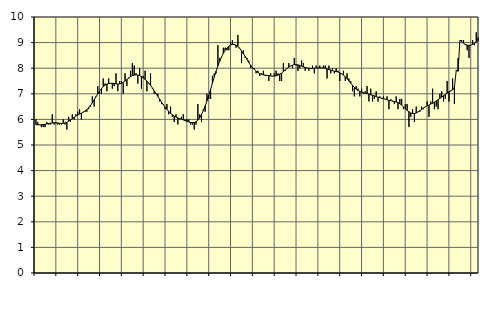
| Category | Piggar | Series 1 |
|---|---|---|
| nan | 6 | 5.79 |
| 1.0 | 5.9 | 5.79 |
| 1.0 | 5.8 | 5.79 |
| 1.0 | 5.7 | 5.79 |
| 1.0 | 5.7 | 5.8 |
| 1.0 | 5.7 | 5.81 |
| 1.0 | 5.9 | 5.82 |
| 1.0 | 5.8 | 5.84 |
| 1.0 | 5.8 | 5.85 |
| 1.0 | 6.2 | 5.86 |
| 1.0 | 5.8 | 5.87 |
| 1.0 | 5.9 | 5.86 |
| nan | 5.8 | 5.86 |
| 2.0 | 5.8 | 5.85 |
| 2.0 | 5.8 | 5.84 |
| 2.0 | 6 | 5.85 |
| 2.0 | 5.8 | 5.86 |
| 2.0 | 5.6 | 5.89 |
| 2.0 | 6.1 | 5.93 |
| 2.0 | 5.9 | 5.98 |
| 2.0 | 6.2 | 6.03 |
| 2.0 | 6 | 6.08 |
| 2.0 | 6.2 | 6.13 |
| 2.0 | 6.3 | 6.17 |
| nan | 6.4 | 6.21 |
| 3.0 | 6 | 6.24 |
| 3.0 | 6.3 | 6.28 |
| 3.0 | 6.3 | 6.33 |
| 3.0 | 6.3 | 6.39 |
| 3.0 | 6.4 | 6.46 |
| 3.0 | 6.5 | 6.55 |
| 3.0 | 6.9 | 6.65 |
| 3.0 | 6.5 | 6.76 |
| 3.0 | 6.9 | 6.88 |
| 3.0 | 7.3 | 7 |
| 3.0 | 7 | 7.11 |
| nan | 7 | 7.2 |
| 4.0 | 7.6 | 7.28 |
| 4.0 | 7.4 | 7.34 |
| 4.0 | 7.1 | 7.38 |
| 4.0 | 7.6 | 7.4 |
| 4.0 | 7.4 | 7.41 |
| 4.0 | 7.2 | 7.41 |
| 4.0 | 7.3 | 7.4 |
| 4.0 | 7.8 | 7.39 |
| 4.0 | 7.1 | 7.38 |
| 4.0 | 7.5 | 7.39 |
| 4.0 | 7.5 | 7.41 |
| nan | 7 | 7.45 |
| 5.0 | 7.8 | 7.5 |
| 5.0 | 7.3 | 7.56 |
| 5.0 | 7.6 | 7.62 |
| 5.0 | 7.9 | 7.67 |
| 5.0 | 8.2 | 7.71 |
| 5.0 | 8.1 | 7.73 |
| 5.0 | 7.8 | 7.74 |
| 5.0 | 7.4 | 7.73 |
| 5.0 | 8 | 7.71 |
| 5.0 | 7.2 | 7.67 |
| 5.0 | 7.7 | 7.62 |
| nan | 7.9 | 7.56 |
| 6.0 | 7.1 | 7.5 |
| 6.0 | 7.4 | 7.42 |
| 6.0 | 7.8 | 7.33 |
| 6.0 | 7.2 | 7.23 |
| 6.0 | 7 | 7.12 |
| 6.0 | 7 | 7.01 |
| 6.0 | 7 | 6.9 |
| 6.0 | 6.7 | 6.79 |
| 6.0 | 6.6 | 6.68 |
| 6.0 | 6.6 | 6.58 |
| 6.0 | 6.4 | 6.48 |
| nan | 6.6 | 6.39 |
| 7.0 | 6.2 | 6.31 |
| 7.0 | 6.5 | 6.24 |
| 7.0 | 6.1 | 6.18 |
| 7.0 | 5.9 | 6.13 |
| 7.0 | 6.2 | 6.09 |
| 7.0 | 5.8 | 6.06 |
| 7.0 | 6 | 6.03 |
| 7.0 | 6.1 | 6.01 |
| 7.0 | 6.2 | 5.98 |
| 7.0 | 6 | 5.95 |
| 7.0 | 6 | 5.93 |
| nan | 6 | 5.9 |
| 8.0 | 5.8 | 5.88 |
| 8.0 | 5.8 | 5.87 |
| 8.0 | 5.6 | 5.88 |
| 8.0 | 5.8 | 5.91 |
| 8.0 | 6.6 | 5.97 |
| 8.0 | 6.2 | 6.06 |
| 8.0 | 5.9 | 6.19 |
| 8.0 | 6.4 | 6.34 |
| 8.0 | 6.3 | 6.52 |
| 8.0 | 7 | 6.72 |
| 8.0 | 6.8 | 6.95 |
| nan | 6.8 | 7.18 |
| 9.0 | 7.7 | 7.41 |
| 9.0 | 7.8 | 7.65 |
| 9.0 | 7.8 | 7.88 |
| 9.0 | 8.9 | 8.09 |
| 9.0 | 8.4 | 8.27 |
| 9.0 | 8.4 | 8.44 |
| 9.0 | 8.8 | 8.58 |
| 9.0 | 8.8 | 8.7 |
| 9.0 | 8.7 | 8.79 |
| 9.0 | 8.7 | 8.86 |
| 9.0 | 9 | 8.91 |
| nan | 9.1 | 8.93 |
| 10.0 | 8.9 | 8.93 |
| 10.0 | 8.8 | 8.9 |
| 10.0 | 9.3 | 8.85 |
| 10.0 | 8.8 | 8.77 |
| 10.0 | 8.2 | 8.68 |
| 10.0 | 8.7 | 8.57 |
| 10.0 | 8.4 | 8.46 |
| 10.0 | 8.4 | 8.34 |
| 10.0 | 8.3 | 8.22 |
| 10.0 | 8 | 8.12 |
| 10.0 | 8 | 8.03 |
| nan | 8 | 7.95 |
| 11.0 | 7.8 | 7.88 |
| 11.0 | 7.9 | 7.83 |
| 11.0 | 7.7 | 7.79 |
| 11.0 | 7.8 | 7.76 |
| 11.0 | 7.9 | 7.74 |
| 11.0 | 7.7 | 7.73 |
| 11.0 | 7.7 | 7.72 |
| 11.0 | 7.5 | 7.71 |
| 11.0 | 7.8 | 7.7 |
| 11.0 | 7.7 | 7.69 |
| 11.0 | 7.8 | 7.69 |
| nan | 7.9 | 7.7 |
| 12.0 | 7.8 | 7.73 |
| 12.0 | 7.5 | 7.77 |
| 12.0 | 7.5 | 7.81 |
| 12.0 | 8.2 | 7.87 |
| 12.0 | 7.9 | 7.93 |
| 12.0 | 8 | 7.99 |
| 12.0 | 8.2 | 8.04 |
| 12.0 | 8.1 | 8.09 |
| 12.0 | 8 | 8.12 |
| 12.0 | 8.4 | 8.14 |
| 12.0 | 8.1 | 8.14 |
| nan | 7.9 | 8.13 |
| 13.0 | 8 | 8.11 |
| 13.0 | 8.3 | 8.08 |
| 13.0 | 8.2 | 8.05 |
| 13.0 | 7.9 | 8.03 |
| 13.0 | 8 | 8.01 |
| 13.0 | 7.9 | 8 |
| 13.0 | 8 | 7.99 |
| 13.0 | 8.1 | 7.99 |
| 13.0 | 7.8 | 8 |
| 13.0 | 8.1 | 8.01 |
| 13.0 | 8 | 8.01 |
| nan | 8.1 | 8.01 |
| 14.0 | 8 | 8.01 |
| 14.0 | 8.1 | 8.01 |
| 14.0 | 8.1 | 7.99 |
| 14.0 | 7.6 | 7.97 |
| 14.0 | 8.1 | 7.95 |
| 14.0 | 7.8 | 7.93 |
| 14.0 | 8 | 7.9 |
| 14.0 | 7.8 | 7.88 |
| 14.0 | 8 | 7.87 |
| 14.0 | 7.9 | 7.85 |
| 14.0 | 7.5 | 7.82 |
| nan | 7.8 | 7.78 |
| 15.0 | 7.9 | 7.73 |
| 15.0 | 7.5 | 7.67 |
| 15.0 | 7.8 | 7.59 |
| 15.0 | 7.6 | 7.5 |
| 15.0 | 7.5 | 7.41 |
| 15.0 | 7.1 | 7.33 |
| 15.0 | 6.9 | 7.25 |
| 15.0 | 7.3 | 7.18 |
| 15.0 | 7.2 | 7.13 |
| 15.0 | 6.9 | 7.09 |
| 15.0 | 7.2 | 7.06 |
| nan | 7 | 7.04 |
| 16.0 | 7.1 | 7.02 |
| 16.0 | 7.3 | 7.01 |
| 16.0 | 6.7 | 6.99 |
| 16.0 | 7.2 | 6.96 |
| 16.0 | 6.7 | 6.94 |
| 16.0 | 6.8 | 6.92 |
| 16.0 | 7.1 | 6.89 |
| 16.0 | 6.7 | 6.87 |
| 16.0 | 6.9 | 6.85 |
| 16.0 | 6.8 | 6.83 |
| 16.0 | 6.9 | 6.81 |
| nan | 6.8 | 6.79 |
| 17.0 | 6.9 | 6.76 |
| 17.0 | 6.4 | 6.74 |
| 17.0 | 6.8 | 6.73 |
| 17.0 | 6.7 | 6.72 |
| 17.0 | 6.6 | 6.7 |
| 17.0 | 6.9 | 6.68 |
| 17.0 | 6.4 | 6.66 |
| 17.0 | 6.8 | 6.61 |
| 17.0 | 6.8 | 6.56 |
| 17.0 | 6.4 | 6.49 |
| 17.0 | 6.6 | 6.42 |
| nan | 6.6 | 6.35 |
| 18.0 | 5.7 | 6.3 |
| 18.0 | 6.1 | 6.25 |
| 18.0 | 6.4 | 6.23 |
| 18.0 | 5.9 | 6.23 |
| 18.0 | 6.5 | 6.25 |
| 18.0 | 6.3 | 6.29 |
| 18.0 | 6.3 | 6.34 |
| 18.0 | 6.5 | 6.39 |
| 18.0 | 6.4 | 6.44 |
| 18.0 | 6.5 | 6.49 |
| 18.0 | 6.7 | 6.53 |
| nan | 6.1 | 6.56 |
| 19.0 | 6.7 | 6.6 |
| 19.0 | 7.2 | 6.63 |
| 19.0 | 6.4 | 6.67 |
| 19.0 | 6.5 | 6.72 |
| 19.0 | 6.4 | 6.77 |
| 19.0 | 7 | 6.82 |
| 19.0 | 7.1 | 6.87 |
| 19.0 | 6.7 | 6.92 |
| 19.0 | 6.8 | 6.97 |
| 19.0 | 7.5 | 7.03 |
| 19.0 | 6.7 | 7.08 |
| nan | 7.1 | 7.12 |
| 20.0 | 7.6 | 7.15 |
| 20.0 | 6.6 | 7.26 |
| 20.0 | 7.9 | 7.92 |
| 20.0 | 8.4 | 7.88 |
| 20.0 | 9.1 | 9.1 |
| 20.0 | 9.1 | 9.03 |
| 20.0 | 9.1 | 8.97 |
| 20.0 | 8.9 | 8.93 |
| 20.0 | 8.7 | 8.9 |
| 20.0 | 8.4 | 8.89 |
| 20.0 | 8.9 | 8.9 |
| nan | 9.1 | 8.93 |
| 21.0 | 8.9 | 8.97 |
| 21.0 | 9.4 | 9.02 |
| 21.0 | 9.2 | 9.07 |